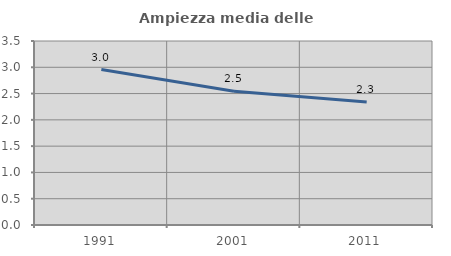
| Category | Ampiezza media delle famiglie |
|---|---|
| 1991.0 | 2.956 |
| 2001.0 | 2.543 |
| 2011.0 | 2.338 |